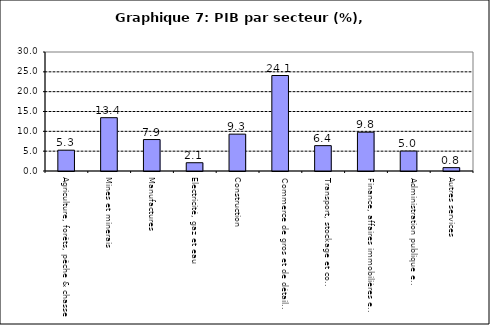
| Category | Series 0 |
|---|---|
| Agriculture, forêts, pêche & chasse | 5.251 |
| Mines et minerais | 13.443 |
| Manufactures | 7.93 |
| Electricité, gaz et eau | 2.087 |
| Construction | 9.296 |
| Commerce de gros et de détail, hôtels et restaurants | 24.073 |
| Transport, stockage et communications                | 6.393 |
| Finance, affaires immobilières et services | 9.79 |
| Administration publique et defense       | 5.03 |
| Autres services                        | 0.848 |